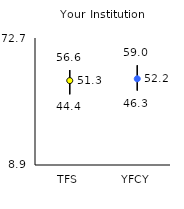
| Category | 25th | 75th | Mean |
|---|---|---|---|
| TFS | 44.4 | 56.6 | 51.3 |
| YFCY | 46.3 | 59 | 52.21 |